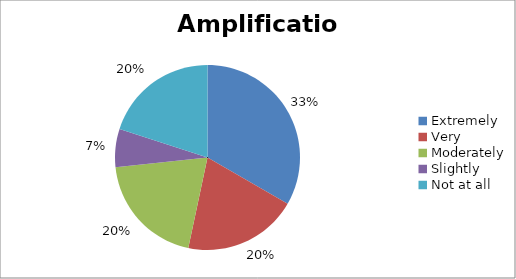
| Category | Amplification |
|---|---|
| Extremely | 5 |
| Very | 3 |
| Moderately | 3 |
| Slightly | 1 |
| Not at all | 3 |